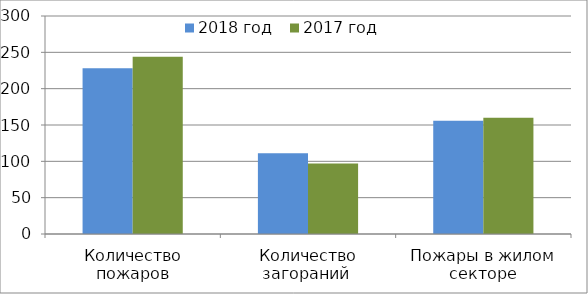
| Category | 2018 год | 2017 год |
|---|---|---|
| Количество пожаров | 228 | 244 |
| Количество загораний  | 111 | 97 |
| Пожары в жилом секторе | 156 | 160 |